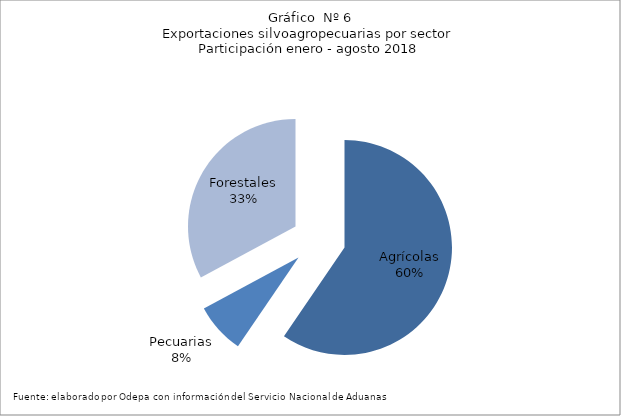
| Category | Series 0 |
|---|---|
| Agrícolas | 7444594 |
| Pecuarias | 952635 |
| Forestales | 4110181 |